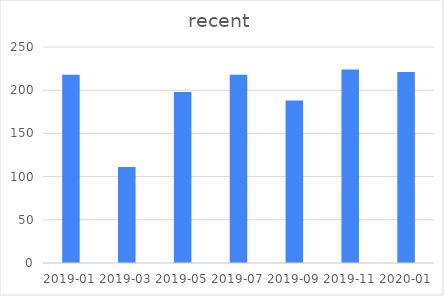
| Category | Series 0 |
|---|---|
| 2019-01 | 218 |
| 2019-03 | 111 |
| 2019-05 | 198 |
| 2019-07 | 218 |
| 2019-09 | 188 |
| 2019-11 | 224 |
| 2020-01 | 221 |